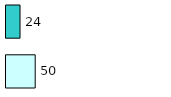
| Category | Series 0 | Series 1 |
|---|---|---|
| 0 | 50 | 24 |